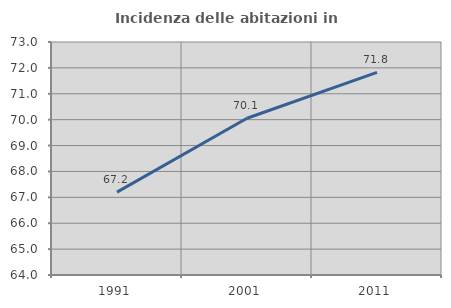
| Category | Incidenza delle abitazioni in proprietà  |
|---|---|
| 1991.0 | 67.203 |
| 2001.0 | 70.056 |
| 2011.0 | 71.829 |